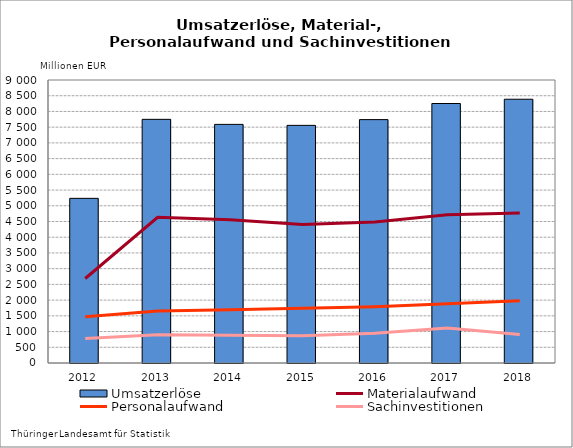
| Category | Umsatzerlöse |
|---|---|
| 2012.0 | 5236 |
| 2013.0 | 7748.836 |
| 2014.0 | 7588.59 |
| 2015.0 | 7557.268 |
| 2016.0 | 7740.227 |
| 2017.0 | 8252.208 |
| 2018.0 | 8388.485 |